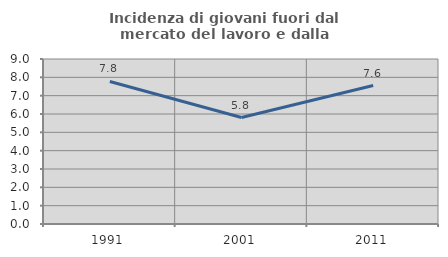
| Category | Incidenza di giovani fuori dal mercato del lavoro e dalla formazione  |
|---|---|
| 1991.0 | 7.774 |
| 2001.0 | 5.806 |
| 2011.0 | 7.553 |